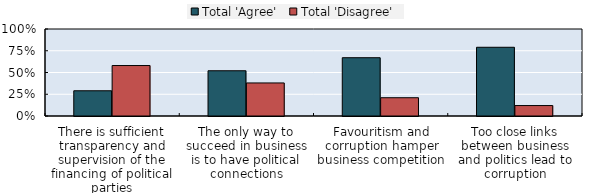
| Category | Total 'Agree' | Total 'Disagree' |
|---|---|---|
| There is sufficient transparency and supervision of the financing of political parties | 0.29 | 0.58 |
| The only way to succeed in business is to have political connections | 0.52 | 0.38 |
| Favouritism and corruption hamper business competition | 0.67 | 0.21 |
| Too close links between business and politics lead to corruption | 0.79 | 0.12 |